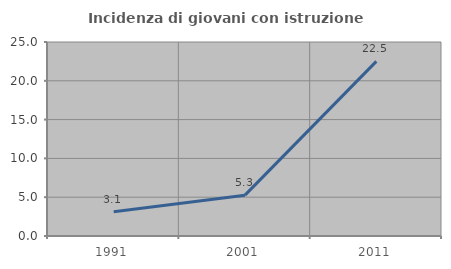
| Category | Incidenza di giovani con istruzione universitaria |
|---|---|
| 1991.0 | 3.125 |
| 2001.0 | 5.263 |
| 2011.0 | 22.5 |